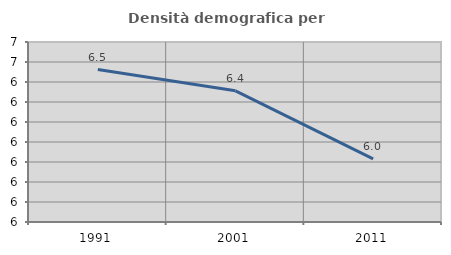
| Category | Densità demografica |
|---|---|
| 1991.0 | 6.462 |
| 2001.0 | 6.356 |
| 2011.0 | 6.016 |